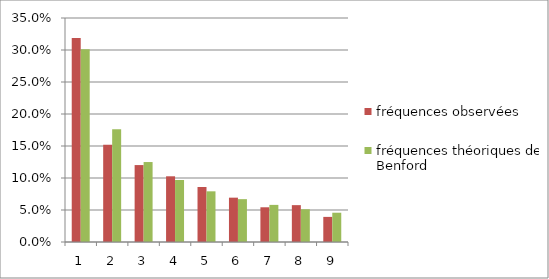
| Category | fréquences observées | fréquences théoriques de Benford |
|---|---|---|
| 0 | 0.319 | 0.301 |
| 1 | 0.152 | 0.176 |
| 2 | 0.12 | 0.125 |
| 3 | 0.103 | 0.097 |
| 4 | 0.086 | 0.079 |
| 5 | 0.069 | 0.067 |
| 6 | 0.054 | 0.058 |
| 7 | 0.058 | 0.051 |
| 8 | 0.039 | 0.046 |